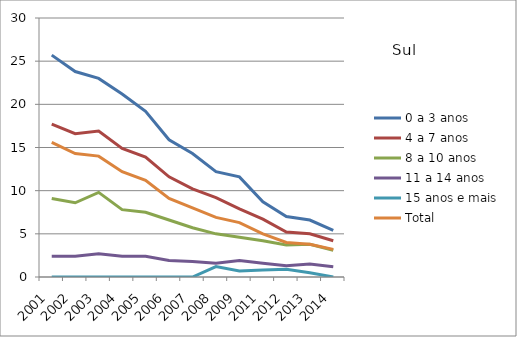
| Category | 0 a 3 anos | 4 a 7 anos | 8 a 10 anos | 11 a 14 anos | 15 anos e mais | Total |
|---|---|---|---|---|---|---|
| 2001.0 | 25.7 | 17.7 | 9.1 | 2.4 | 0 | 15.6 |
| 2002.0 | 23.8 | 16.6 | 8.6 | 2.4 | 0 | 14.3 |
| 2003.0 | 23 | 16.9 | 9.8 | 2.7 | 0 | 14 |
| 2004.0 | 21.2 | 14.9 | 7.8 | 2.4 | 0 | 12.2 |
| 2005.0 | 19.2 | 13.9 | 7.5 | 2.4 | 0 | 11.2 |
| 2006.0 | 15.9 | 11.6 | 6.6 | 1.9 | 0 | 9.1 |
| 2007.0 | 14.3 | 10.2 | 5.7 | 1.8 | 0 | 8 |
| 2008.0 | 12.2 | 9.2 | 5 | 1.6 | 1.2 | 6.9 |
| 2009.0 | 11.6 | 7.9 | 4.6 | 1.9 | 0.7 | 6.3 |
| 2011.0 | 8.7 | 6.7 | 4.2 | 1.6 | 0.8 | 5 |
| 2012.0 | 7 | 5.2 | 3.7 | 1.3 | 0.9 | 4 |
| 2013.0 | 6.6 | 5 | 3.8 | 1.5 | 0.5 | 3.8 |
| 2014.0 | 5.4 | 4.2 | 3.1 | 1.2 | 0 | 3.2 |